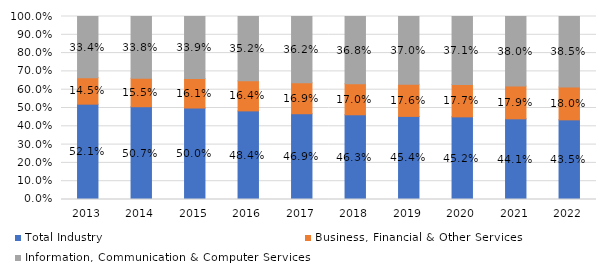
| Category | Total Industry | Business, Financial & Other Services | Information, Communication & Computer Services |
|---|---|---|---|
| 2013 | 0.521 | 0.145 | 0.334 |
| 2014 | 0.507 | 0.155 | 0.338 |
| 2015 | 0.5 | 0.161 | 0.339 |
| 2016 | 0.484 | 0.164 | 0.352 |
| 2017 | 0.469 | 0.169 | 0.362 |
| 2018 | 0.463 | 0.17 | 0.368 |
| 2019 | 0.454 | 0.176 | 0.37 |
| 2020 | 0.452 | 0.177 | 0.371 |
| 2021 | 0.441 | 0.179 | 0.38 |
| 2022 | 0.435 | 0.18 | 0.385 |